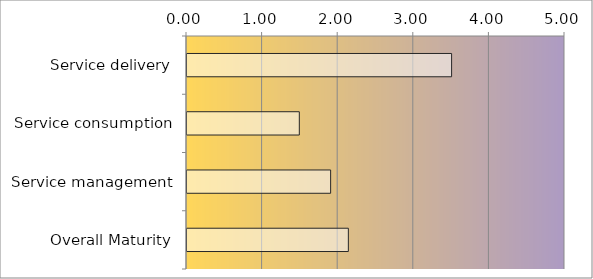
| Category | Series 0 |
|---|---|
| Service delivery | 3.5 |
| Service consumption | 1.486 |
| Service management | 1.9 |
| Overall Maturity | 2.134 |